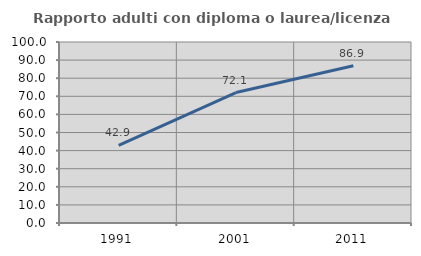
| Category | Rapporto adulti con diploma o laurea/licenza media  |
|---|---|
| 1991.0 | 42.857 |
| 2001.0 | 72.055 |
| 2011.0 | 86.885 |